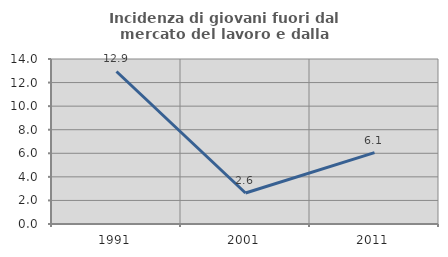
| Category | Incidenza di giovani fuori dal mercato del lavoro e dalla formazione  |
|---|---|
| 1991.0 | 12.941 |
| 2001.0 | 2.632 |
| 2011.0 | 6.061 |